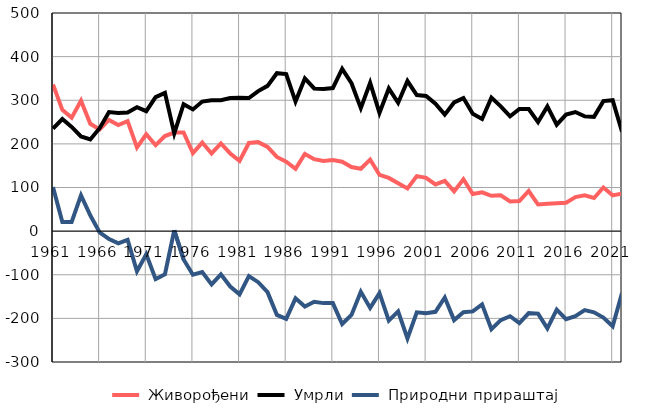
| Category |  Живорођени |  Умрли |  Природни прираштај |
|---|---|---|---|
| 1961.0 | 336 | 235 | 101 |
| 1962.0 | 278 | 257 | 21 |
| 1963.0 | 260 | 239 | 21 |
| 1964.0 | 299 | 217 | 82 |
| 1965.0 | 246 | 210 | 36 |
| 1966.0 | 233 | 236 | -3 |
| 1967.0 | 255 | 273 | -18 |
| 1968.0 | 243 | 271 | -28 |
| 1969.0 | 252 | 272 | -20 |
| 1970.0 | 192 | 284 | -92 |
| 1971.0 | 222 | 275 | -53 |
| 1972.0 | 197 | 307 | -110 |
| 1973.0 | 218 | 317 | -99 |
| 1974.0 | 226 | 224 | 2 |
| 1975.0 | 226 | 291 | -65 |
| 1976.0 | 179 | 279 | -100 |
| 1977.0 | 203 | 297 | -94 |
| 1978.0 | 178 | 300 | -122 |
| 1979.0 | 201 | 300 | -99 |
| 1980.0 | 178 | 305 | -127 |
| 1981.0 | 161 | 306 | -145 |
| 1982.0 | 202 | 305 | -103 |
| 1983.0 | 204 | 321 | -117 |
| 1984.0 | 193 | 333 | -140 |
| 1985.0 | 170 | 362 | -192 |
| 1986.0 | 159 | 360 | -201 |
| 1987.0 | 143 | 297 | -154 |
| 1988.0 | 177 | 350 | -173 |
| 1989.0 | 165 | 327 | -162 |
| 1990.0 | 161 | 326 | -165 |
| 1991.0 | 163 | 328 | -165 |
| 1992.0 | 159 | 372 | -213 |
| 1993.0 | 147 | 339 | -192 |
| 1994.0 | 143 | 282 | -139 |
| 1995.0 | 164 | 340 | -176 |
| 1996.0 | 129 | 271 | -142 |
| 1997.0 | 122 | 327 | -205 |
| 1998.0 | 110 | 294 | -184 |
| 1999.0 | 98 | 344 | -246 |
| 2000.0 | 126 | 312 | -186 |
| 2001.0 | 122 | 310 | -188 |
| 2002.0 | 107 | 292 | -185 |
| 2003.0 | 115 | 267 | -152 |
| 2004.0 | 91 | 295 | -204 |
| 2005.0 | 119 | 305 | -186 |
| 2006.0 | 85 | 269 | -184 |
| 2007.0 | 89 | 257 | -168 |
| 2008.0 | 81 | 306 | -225 |
| 2009.0 | 82 | 286 | -204 |
| 2010.0 | 68 | 263 | -195 |
| 2011.0 | 69 | 280 | -211 |
| 2012.0 | 92 | 280 | -188 |
| 2013.0 | 61 | 250 | -189 |
| 2014.0 | 63 | 286 | -223 |
| 2015.0 | 64 | 244 | -180 |
| 2016.0 | 65 | 267 | -202 |
| 2017.0 | 78 | 273 | -195 |
| 2018.0 | 82 | 263 | -181 |
| 2019.0 | 76 | 262 | -186 |
| 2020.0 | 100 | 298 | -198 |
| 2021.0 | 82 | 300 | -218 |
| 2022.0 | 86 | 228 | -142 |